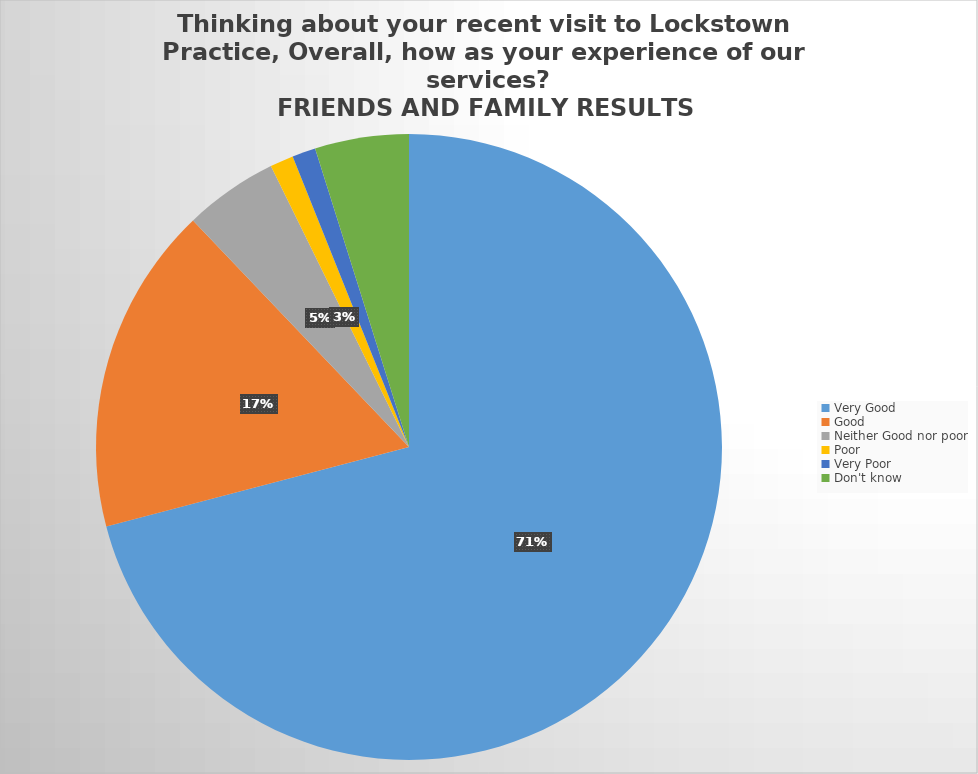
| Category | Responses |
|---|---|
| Very Good | 117 |
| Good | 28 |
| Neither Good nor poor | 8 |
| Poor | 2 |
| Very Poor | 2 |
| Don't know  | 8 |